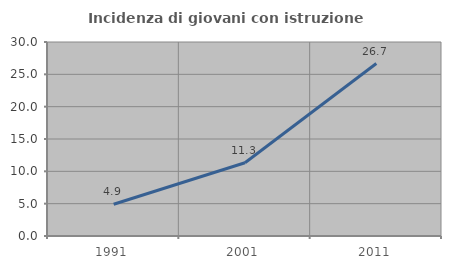
| Category | Incidenza di giovani con istruzione universitaria |
|---|---|
| 1991.0 | 4.918 |
| 2001.0 | 11.321 |
| 2011.0 | 26.667 |